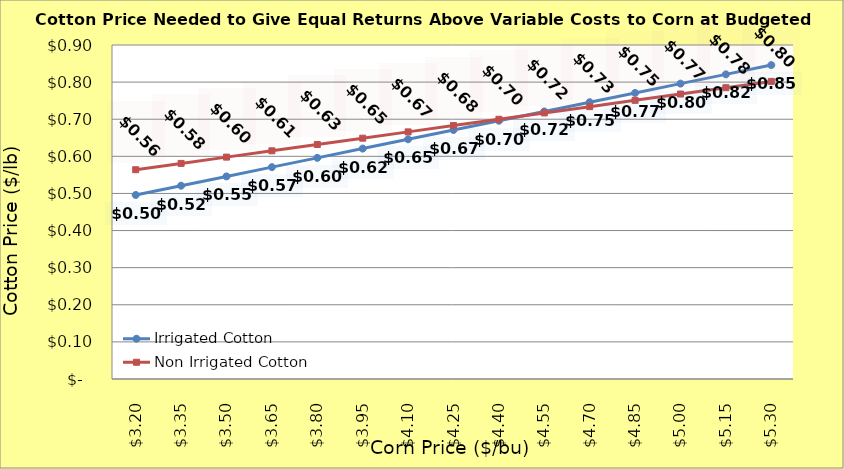
| Category | Irrigated Cotton | Non Irrigated Cotton |
|---|---|---|
| 3.2 | 0.496 | 0.564 |
| 3.35 | 0.521 | 0.581 |
| 3.5 | 0.546 | 0.598 |
| 3.65 | 0.571 | 0.615 |
| 3.8 | 0.596 | 0.632 |
| 3.9499999999999997 | 0.621 | 0.649 |
| 4.1 | 0.646 | 0.666 |
| 4.25 | 0.671 | 0.683 |
| 4.4 | 0.696 | 0.7 |
| 4.550000000000001 | 0.721 | 0.717 |
| 4.700000000000001 | 0.746 | 0.734 |
| 4.850000000000001 | 0.771 | 0.751 |
| 5.000000000000002 | 0.796 | 0.768 |
| 5.150000000000002 | 0.821 | 0.785 |
| 5.3000000000000025 | 0.846 | 0.802 |